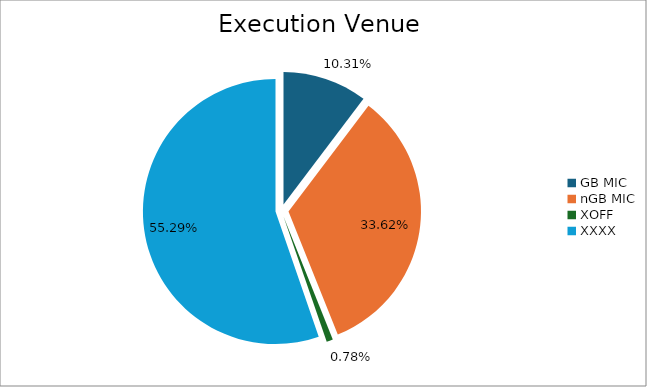
| Category | Series 0 |
|---|---|
| GB MIC | 1221614.846 |
| nGB MIC | 3982067.9 |
| XOFF | 92077.281 |
| XXXX | 6548527.142 |